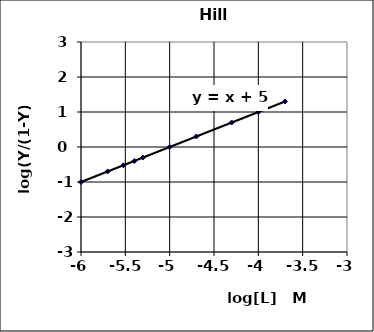
| Category | Series 0 |
|---|---|
| -6.0 | -1 |
| -5.698970004336019 | -0.699 |
| -5.522878745280337 | -0.523 |
| -5.3979400086720375 | -0.398 |
| -5.301029995663981 | -0.301 |
| -5.0 | 0 |
| -4.698970004336019 | 0.301 |
| -4.301029995663981 | 0.699 |
| -4.0 | 1 |
| -3.6989700043360187 | 1.301 |